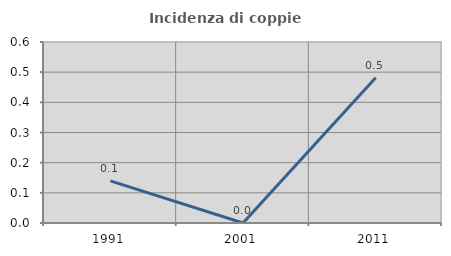
| Category | Incidenza di coppie miste |
|---|---|
| 1991.0 | 0.14 |
| 2001.0 | 0 |
| 2011.0 | 0.481 |